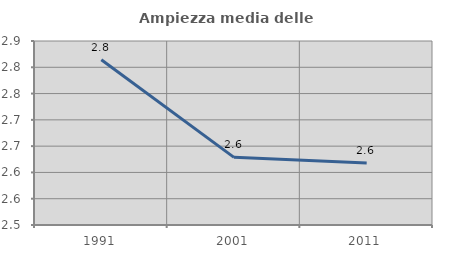
| Category | Ampiezza media delle famiglie |
|---|---|
| 1991.0 | 2.814 |
| 2001.0 | 2.629 |
| 2011.0 | 2.618 |